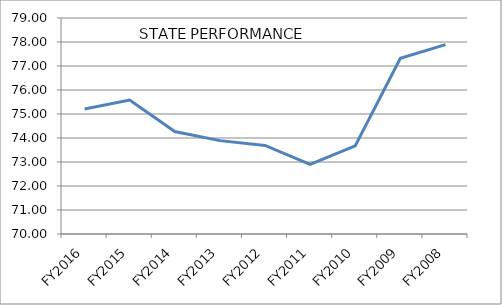
| Category | Series 0 |
|---|---|
| FY2016 | 75.209 |
| FY2015 | 75.579 |
| FY2014 | 74.272 |
| FY2013 | 73.89 |
| FY2012 | 73.691 |
| FY2011 | 72.897 |
| FY2010 | 73.67 |
| FY2009 | 77.32 |
| FY2008 | 77.89 |